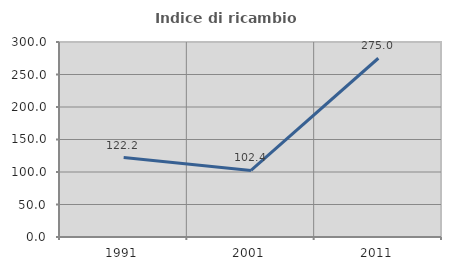
| Category | Indice di ricambio occupazionale  |
|---|---|
| 1991.0 | 122.222 |
| 2001.0 | 102.381 |
| 2011.0 | 275 |